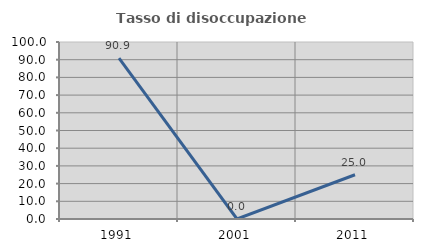
| Category | Tasso di disoccupazione giovanile  |
|---|---|
| 1991.0 | 90.909 |
| 2001.0 | 0 |
| 2011.0 | 25 |